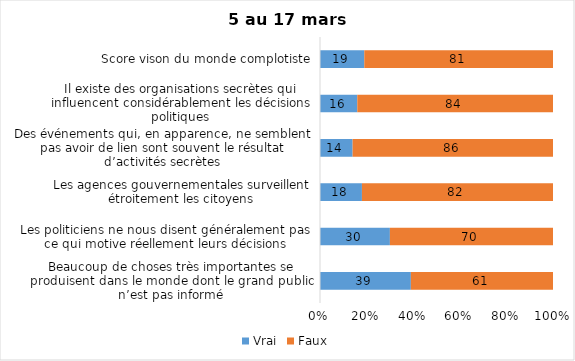
| Category | Vrai | Faux |
|---|---|---|
| Beaucoup de choses très importantes se produisent dans le monde dont le grand public n’est pas informé | 39 | 61 |
| Les politiciens ne nous disent généralement pas ce qui motive réellement leurs décisions | 30 | 70 |
| Les agences gouvernementales surveillent étroitement les citoyens | 18 | 82 |
| Des événements qui, en apparence, ne semblent pas avoir de lien sont souvent le résultat d’activités secrètes | 14 | 86 |
| Il existe des organisations secrètes qui influencent considérablement les décisions politiques | 16 | 84 |
| Score vison du monde complotiste | 19 | 81 |